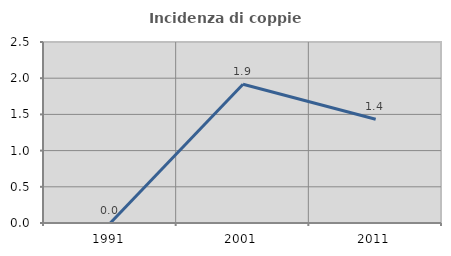
| Category | Incidenza di coppie miste |
|---|---|
| 1991.0 | 0 |
| 2001.0 | 1.917 |
| 2011.0 | 1.434 |